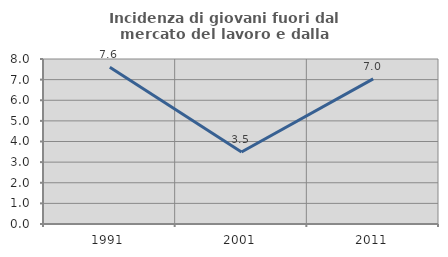
| Category | Incidenza di giovani fuori dal mercato del lavoro e dalla formazione  |
|---|---|
| 1991.0 | 7.603 |
| 2001.0 | 3.491 |
| 2011.0 | 7.038 |